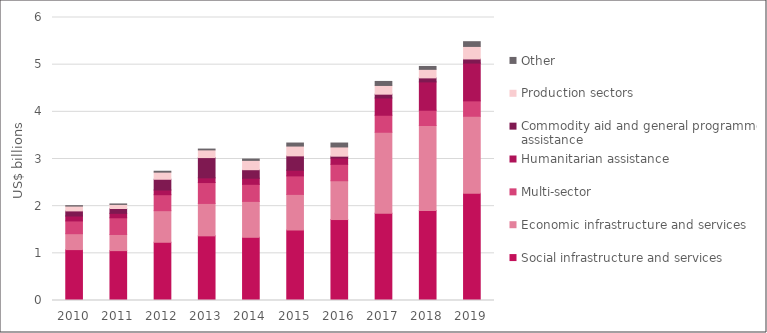
| Category | Social infrastructure and services | Economic infrastructure and services | Multi-sector | Humanitarian assistance | Commodity aid and general programme assistance | Production sectors | Other |
|---|---|---|---|---|---|---|---|
| 2010.0 | 1078.976 | 337.3 | 270.59 | 104.59 | 108.177 | 102.369 | 8.571 |
| 2011.0 | 1057.349 | 342.617 | 353.512 | 94.626 | 102.767 | 86.305 | 9.71 |
| 2012.0 | 1234.702 | 669.545 | 338.606 | 99.682 | 228.023 | 150.843 | 19.081 |
| 2013.0 | 1370.846 | 687.054 | 442.703 | 100.074 | 429.235 | 163.237 | 17.568 |
| 2014.0 | 1339.976 | 761.132 | 362.102 | 129.042 | 180.651 | 197.826 | 28.226 |
| 2015.0 | 1494.836 | 754.623 | 392.435 | 120.736 | 303.891 | 207.887 | 64.337 |
| 2016.0 | 1716.576 | 822.369 | 348.48 | 132.992 | 39.431 | 195.403 | 83.445 |
| 2017.0 | 1849.248 | 1717.728 | 360.514 | 365.915 | 80.915 | 184.757 | 85.406 |
| 2018.0 | 1908.919 | 1800.92 | 323.952 | 600.648 | 85.484 | 180.674 | 61.568 |
| 2019.0 | 2272.79 | 1633.256 | 326.606 | 801.244 | 87.489 | 265.383 | 100.262 |